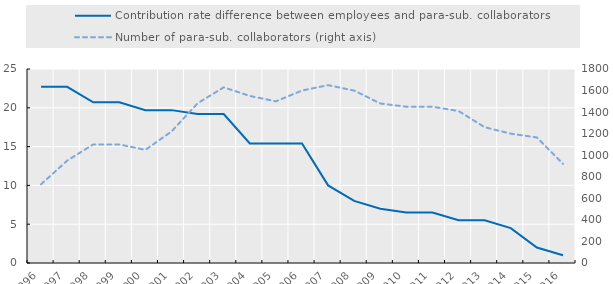
| Category | Contribution rate difference between employees and para-sub. collaborators |
|---|---|
| 1996.0 | 22.7 |
| 1997.0 | 22.7 |
| 1998.0 | 20.7 |
| 1999.0 | 20.7 |
| 2000.0 | 19.7 |
| 2001.0 | 19.7 |
| 2002.0 | 19.2 |
| 2003.0 | 19.2 |
| 2004.0 | 15.4 |
| 2005.0 | 15.4 |
| 2006.0 | 15.4 |
| 2007.0 | 10 |
| 2008.0 | 8 |
| 2009.0 | 7 |
| 2010.0 | 6.5 |
| 2011.0 | 6.5 |
| 2012.0 | 5.5 |
| 2013.0 | 5.5 |
| 2014.0 | 4.5 |
| 2015.0 | 2 |
| 2016.0 | 1 |